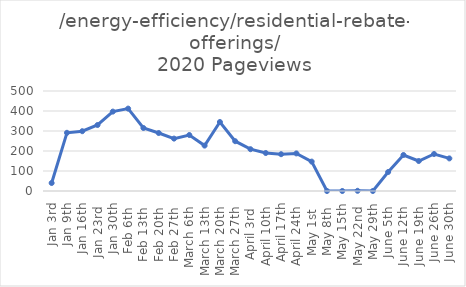
| Category | Pageviews |
|---|---|
| Jan 3rd | 40 |
| Jan 9th | 291 |
| Jan 16th | 299 |
| Jan 23rd  | 330 |
| Jan 30th | 397 |
| Feb 6th  | 412 |
| Feb 13th  | 315 |
| Feb 20th  | 290 |
| Feb 27th  | 262 |
| March 6th  | 280 |
| March 13th  | 227 |
| March 20th  | 345 |
| March 27th  | 249 |
| April 3rd  | 209 |
| April 10th  | 190 |
| April 17th | 184 |
| April 24th  | 188 |
| May 1st  | 147 |
| May 8th  | 0 |
| May 15th | 0 |
| May 22nd  | 1 |
| May 29th | 0 |
| June 5th  | 95 |
| June 12th  | 180 |
| June 19th  | 150 |
| June 26th | 185 |
| June 30th | 163 |